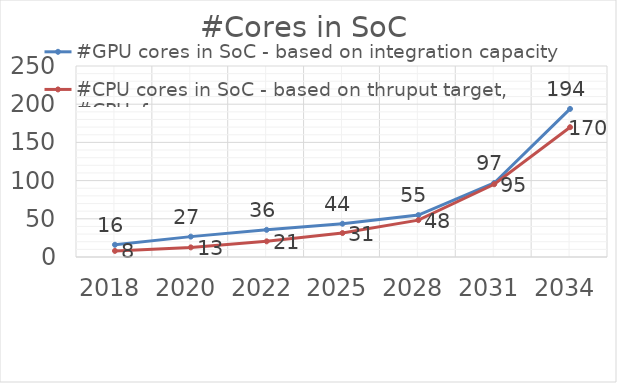
| Category | #GPU cores in SoC - based on integration capacity | #CPU cores in SoC - based on thruput target, #CPUxfmax |
|---|---|---|
| 2018.0 | 16 | 8 |
| 2020.0 | 26.667 | 12.594 |
| 2022.0 | 35.556 | 20.506 |
| 2025.0 | 43.537 | 31.339 |
| 2028.0 | 54.857 | 48.249 |
| 2031.0 | 96.923 | 95.238 |
| 2034.0 | 193.846 | 169.886 |